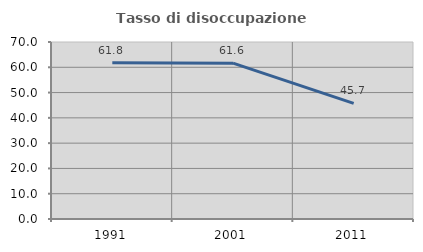
| Category | Tasso di disoccupazione giovanile  |
|---|---|
| 1991.0 | 61.78 |
| 2001.0 | 61.628 |
| 2011.0 | 45.714 |